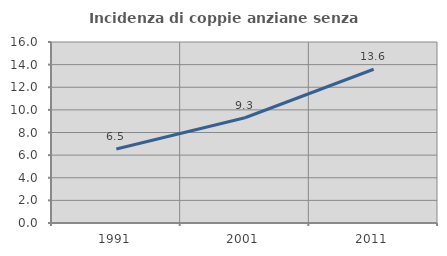
| Category | Incidenza di coppie anziane senza figli  |
|---|---|
| 1991.0 | 6.548 |
| 2001.0 | 9.305 |
| 2011.0 | 13.591 |